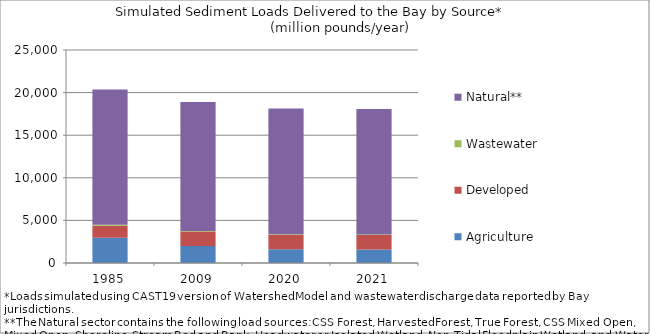
| Category | Agriculture | Developed | Wastewater | Natural** |
|---|---|---|---|---|
| 1985.0 | 2977.836 | 1382.732 | 125.811 | 15879.557 |
| 2009.0 | 2007.27 | 1683.184 | 60.487 | 15159.816 |
| 2020.0 | 1627.226 | 1700.264 | 43.368 | 14771.286 |
| 2021.0 | 1583.42 | 1712.822 | 46.36 | 14725.378 |